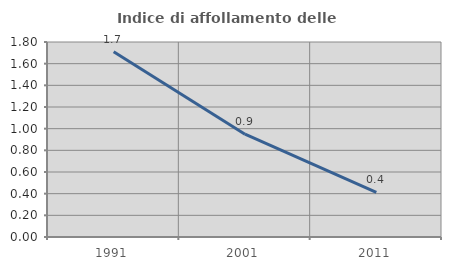
| Category | Indice di affollamento delle abitazioni  |
|---|---|
| 1991.0 | 1.71 |
| 2001.0 | 0.949 |
| 2011.0 | 0.411 |